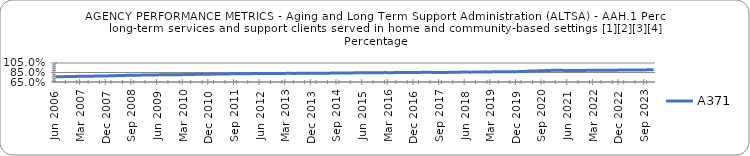
| Category | A371 |
|---|---|
| 0.76721 | 0.761 |
| 0.76724 | 0.761 |
| 0.76937 | 0.762 |
| 0.77188 | 0.763 |
| 0.77291 | 0.764 |
| 0.77287 | 0.765 |
| 0.77281 | 0.767 |
| 0.77321 | 0.767 |
| 0.77487 | 0.769 |
| 0.77588 | 0.772 |
| 0.77547 | 0.773 |
| 0.77665 | 0.773 |
| 0.77799 | 0.773 |
| 0.78001 | 0.773 |
| 0.78165 | 0.775 |
| 0.78378 | 0.776 |
| 0.78567 | 0.775 |
| 0.78719 | 0.777 |
| 0.7887 | 0.778 |
| 0.79022 | 0.78 |
| 0.79129 | 0.782 |
| 0.79193 | 0.784 |
| 0.79455 | 0.786 |
| 0.79439 | 0.787 |
| 0.79457 | 0.789 |
| 0.79632 | 0.79 |
| 0.79721 | 0.791 |
| 0.79865 | 0.792 |
| 0.79917 | 0.795 |
| 0.79965 | 0.794 |
| 0.79991 | 0.795 |
| 0.80036 | 0.796 |
| 0.80119 | 0.797 |
| 0.80135 | 0.799 |
| 0.80196 | 0.799 |
| 0.80282 | 0.8 |
| 0.80375 | 0.8 |
| 0.80441 | 0.8 |
| 0.80454 | 0.801 |
| 0.80574 | 0.801 |
| 0.80717 | 0.802 |
| 0.80907 | 0.803 |
| 0.80996 | 0.804 |
| 0.81048 | 0.804 |
| 0.81132 | 0.805 |
| 0.81235 | 0.806 |
| 0.81422 | 0.807 |
| 0.81521 | 0.809 |
| 0.81511 | 0.81 |
| 0.816 | 0.81 |
| 0.81562 | 0.811 |
| 0.8177 | 0.812 |
| 0.81902 | 0.814 |
| 0.81999 | 0.815 |
| 0.8202 | 0.815 |
| 0.82092 | 0.816 |
| 0.82336 | 0.816 |
| 0.82379 | 0.818 |
| 0.82545 | 0.819 |
| 0.82578 | 0.82 |
| 0.82632 | 0.82 |
| 0.82543 | 0.821 |
| 0.82484 | 0.823 |
| 0.82636 | 0.824 |
| 0.82733 | 0.825 |
| 0.82838 | 0.826 |
| 0.82888 | 0.826 |
| 0.82809 | 0.825 |
| 0.82917 | 0.825 |
| 0.82866 | 0.826 |
| 0.82858 | 0.827 |
| 0.82802 | 0.828 |
| 0.82938 | 0.829 |
| 0.83046 | 0.828 |
| 0.83086 | 0.829 |
| 0.83171 | 0.829 |
| 0.83162 | 0.829 |
| 0.83156 | 0.828 |
| 0.8309 | 0.829 |
| 0.83222 | 0.83 |
| 0.83276 | 0.831 |
| 0.83338 | 0.832 |
| 0.83336 | 0.832 |
| 0.83239 | 0.832 |
| 0.83251 | 0.831 |
| 0.8337 | 0.832 |
| 0.83426 | 0.833 |
| 0.83557 | 0.833 |
| 0.83627 | 0.833 |
| 0.83614 | 0.832 |
| 0.83597 | 0.833 |
| 0.83796 | 0.834 |
| 0.83821 | 0.834 |
| 0.83855 | 0.836 |
| 0.84014 | 0.836 |
| 0.83995 | 0.836 |
| 0.84007 | 0.836 |
| 0.8402 | 0.838 |
| 0.841 | 0.838 |
| 0.8424 | 0.839 |
| 0.8431 | 0.84 |
| 0.8435 | 0.84 |
| 0.8439 | 0.84 |
| 0.84383 | 0.84 |
| 0.84463 | 0.841 |
| 0.84443 | 0.842 |
| 0.84487 | 0.843 |
| 0.84543 | 0.844 |
| 0.8466 | 0.844 |
| 0.84682 | 0.844 |
| 0.84816 | 0.845 |
| 0.84589 | 0.844 |
| 0.84646 | 0.845 |
| 0.84772 | 0.845 |
| 0.8486 | 0.847 |
| 0.84786 | 0.847 |
| 0.84849 | 0.848 |
| 0.84851 | 0.846 |
| 0.8492 | 0.846 |
| 0.84852 | 0.848 |
| 0.84989 | 0.849 |
| 0.85076 | 0.848 |
| 0.85196 | 0.848 |
| 0.8534 | 0.849 |
| 0.85355 | 0.849 |
| 0.85326 | 0.849 |
| 0.85294 | 0.85 |
| 0.85119 | 0.851 |
| 0.85152 | 0.852 |
| 0.85143 | 0.853 |
| 0.85182 | 0.854 |
| 0.8521 | 0.853 |
| 0.85264 | 0.853 |
| 0.85441 | 0.851 |
| 0.85526 | 0.852 |
| 0.85728 | 0.851 |
| 0.8577 | 0.852 |
| 0.85845 | 0.852 |
| 0.85828 | 0.853 |
| 0.85799 | 0.854 |
| 0.85772 | 0.855 |
| 0.85887 | 0.857 |
| 0.86116 | 0.858 |
| 0.86123 | 0.858 |
| 0.86193 | 0.858 |
| 0.86372 | 0.858 |
| 0.86147 | 0.858 |
| 0.86303 | 0.859 |
| 0.86431 | 0.861 |
| 0.86533 | 0.861 |
| 0.86473 | 0.862 |
| 0.86411 | 0.864 |
| 0.86504 | 0.861 |
| 0.86518 | 0.863 |
| 0.86641 | 0.864 |
| 0.86717 | 0.865 |
| 0.86792 | 0.865 |
| 0.8694 | 0.864 |
| 0.86921 | 0.865 |
| 0.87375 | 0.865 |
| 0.87927 | 0.866 |
| 0.88196 | 0.867 |
| 0.8826 | 0.868 |
| 0.88378 | 0.869 |
| 0.88511 | 0.869 |
| 0.8857 | 0.874 |
| 0.88923 | 0.879 |
| 0.89424 | 0.882 |
| 0.89466 | 0.883 |
| 0.89512 | 0.884 |
| 0.89475 | 0.885 |
| 0.89525 | 0.886 |
| 0.89485 | 0.889 |
| 0.89346 | 0.894 |
| 0.89386 | 0.895 |
| 0.89048 | 0.895 |
| 0.89013 | 0.895 |
| 0.89185 | 0.895 |
| 0.8934 | 0.895 |
| 0.89298 | 0.893 |
| 0.89372 | 0.894 |
| 0.89661 | 0.89 |
| 0.89824 | 0.89 |
| 0.89708 | 0.892 |
| 0.89662 | 0.893 |
| 0.89759 | 0.893 |
| 0.89814 | 0.894 |
| 0.89823 | 0.897 |
| 0.89819 | 0.898 |
| 0.89789 | 0.897 |
| 0.89829 | 0.897 |
| 0.89874 | 0.898 |
| 0.90061 | 0.898 |
| 0.90125 | 0.898 |
| 0.90115 | 0.898 |
| 0.90196 | 0.898 |
| 0.90133 | 0.898 |
| 0.90135 | 0.899 |
| 0.90118 | 0.901 |
| 0.90219 | 0.901 |
| 0.90296 | 0.901 |
| 0.90356 | 0.902 |
| 0.90607 | 0.901 |
| 0.90755 | 0.901 |
| 0.91023 | 0.901 |
| nan | 0.902 |
| nan | 0.903 |
| nan | 0.904 |
| nan | 0.906 |
| nan | 0.908 |
| nan | 0.91 |